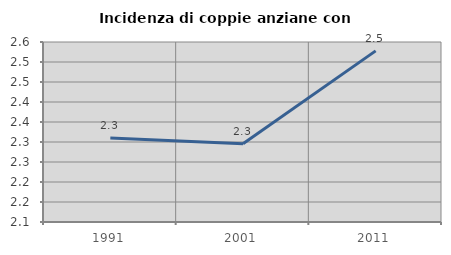
| Category | Incidenza di coppie anziane con figli |
|---|---|
| 1991.0 | 2.31 |
| 2001.0 | 2.295 |
| 2011.0 | 2.528 |